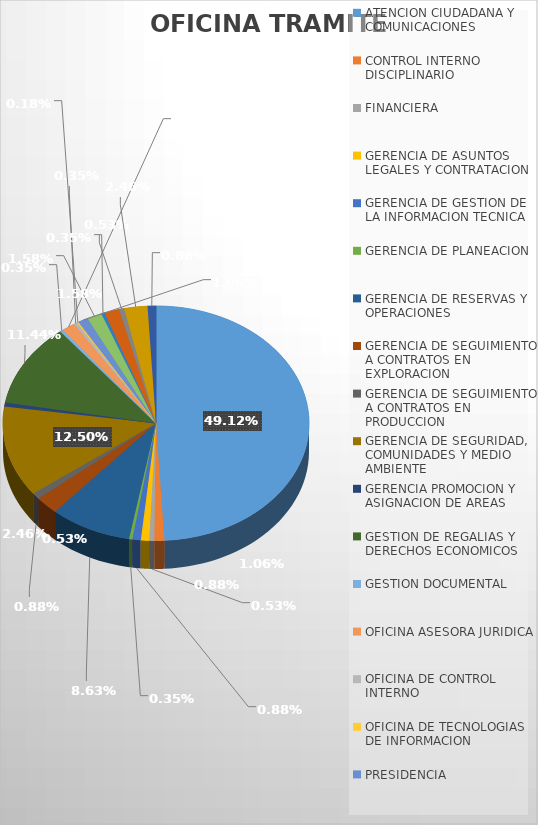
| Category | Series 0 |
|---|---|
| ATENCION CIUDADANA Y COMUNICACIONES | 279 |
| CONTROL INTERNO DISCIPLINARIO | 6 |
| FINANCIERA | 3 |
| GERENCIA DE ASUNTOS LEGALES Y CONTRATACION | 5 |
| GERENCIA DE GESTION DE LA INFORMACION TECNICA | 5 |
| GERENCIA DE PLANEACION | 2 |
| GERENCIA DE RESERVAS Y OPERACIONES | 49 |
| GERENCIA DE SEGUIMIENTO A CONTRATOS EN EXPLORACION | 14 |
| GERENCIA DE SEGUIMIENTO A CONTRATOS EN PRODUCCION | 5 |
| GERENCIA DE SEGURIDAD, COMUNIDADES Y MEDIO AMBIENTE | 71 |
| GERENCIA PROMOCION Y ASIGNACION DE AREAS | 3 |
| GESTION DE REGALIAS Y DERECHOS ECONOMICOS | 65 |
| GESTION DOCUMENTAL | 2 |
| OFICINA ASESORA JURIDICA | 8 |
| OFICINA DE CONTROL INTERNO | 2 |
| OFICINA DE TECNOLOGIAS DE INFORMACION | 1 |
| PRESIDENCIA | 6 |
| TALENTO HUMANO | 9 |
| VICEPRESIDENCIA ADMINISTRATIVA Y FINANCIERA | 2 |
| VICEPRESIDENCIA CONTRATOS DE HIDROCARBUROS | 9 |
| VICEPRESIDENCIA DE OPERACIONES, REGALIAS Y PARTICIPACIONES | 3 |
| VICEPRESIDENCIA PROMOCION Y ASIGNACION DE AREAS | 14 |
| VICEPRESIDENCIA TECNICA | 5 |